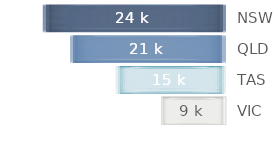
| Category | Series 0 |
|---|---|
| NSW | 24.3 |
| QLD | 20.655 |
| TAS | 14.58 |
| VIC | 8.505 |